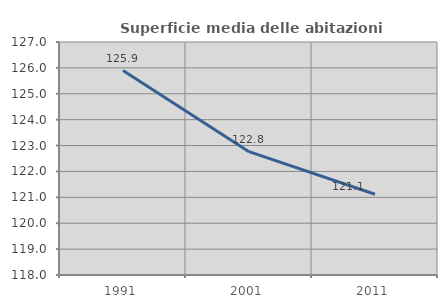
| Category | Superficie media delle abitazioni occupate |
|---|---|
| 1991.0 | 125.897 |
| 2001.0 | 122.764 |
| 2011.0 | 121.118 |